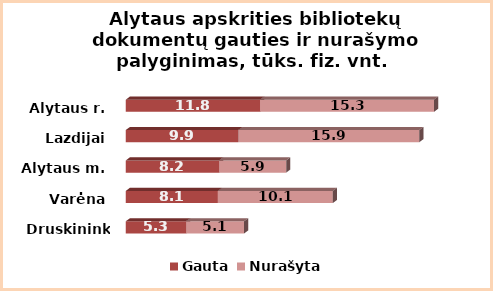
| Category | Gauta | Nurašyta |
|---|---|---|
| Druskininkai | 5.3 | 5.1 |
| Varėna | 8.1 | 10.1 |
| Alytaus m. | 8.2 | 5.9 |
| Lazdijai | 9.9 | 15.9 |
| Alytaus r. | 11.8 | 15.3 |